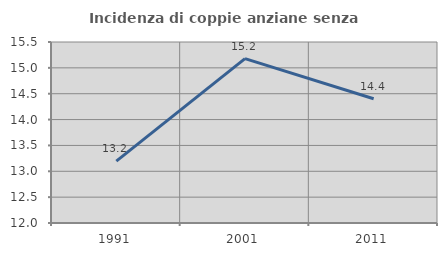
| Category | Incidenza di coppie anziane senza figli  |
|---|---|
| 1991.0 | 13.196 |
| 2001.0 | 15.179 |
| 2011.0 | 14.403 |